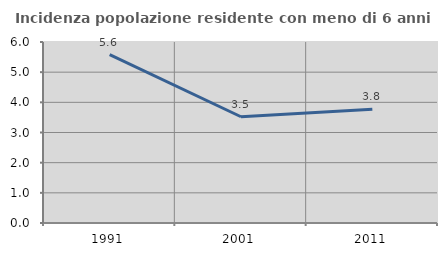
| Category | Incidenza popolazione residente con meno di 6 anni |
|---|---|
| 1991.0 | 5.579 |
| 2001.0 | 3.522 |
| 2011.0 | 3.771 |